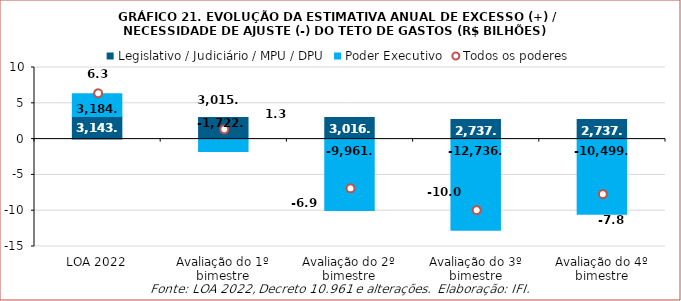
| Category | Legislativo / Judiciário / MPU / DPU | Poder Executivo |
|---|---|---|
| LOA 2022 | 3143 | 3184 |
| Avaliação do 1º bimestre | 3015.6 | -1722.3 |
| Avaliação do 2º bimestre | 3016 | -9961.4 |
| Avaliação do 3º bimestre | 2737.9 | -12736.8 |
| Avaliação do 4º bimestre | 2737.9 | -10499.9 |